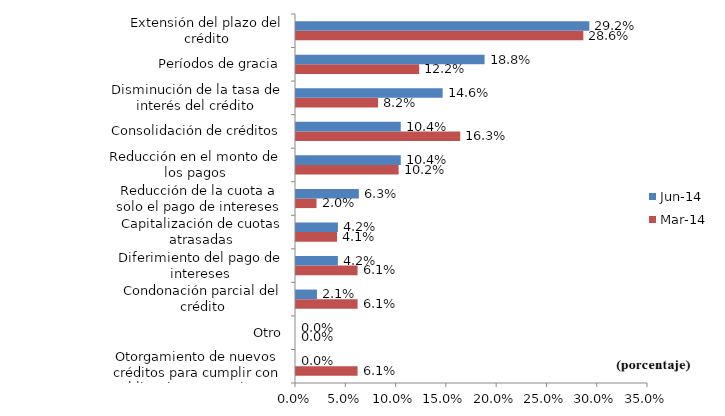
| Category | mar-14 | jun-14 |
|---|---|---|
| Otorgamiento de nuevos créditos para cumplir con obligaciones anteriores | 0.061 | 0 |
| Otro | 0 | 0 |
| Condonación parcial del crédito | 0.061 | 0.021 |
| Diferimiento del pago de intereses | 0.061 | 0.042 |
| Capitalización de cuotas atrasadas | 0.041 | 0.042 |
| Reducción de la cuota a solo el pago de intereses | 0.02 | 0.062 |
| Reducción en el monto de los pagos | 0.102 | 0.104 |
| Consolidación de créditos | 0.163 | 0.104 |
| Disminución de la tasa de interés del crédito | 0.082 | 0.146 |
| Períodos de gracia | 0.122 | 0.188 |
| Extensión del plazo del crédito | 0.286 | 0.292 |